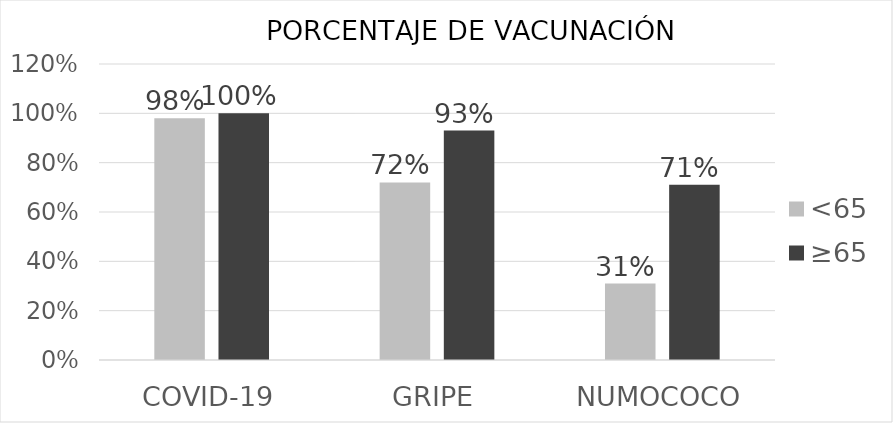
| Category | <65 | ≥65 |
|---|---|---|
| COVID-19 | 0.98 | 1 |
| GRIPE | 0.72 | 0.93 |
| NUMOCOCO | 0.31 | 0.71 |